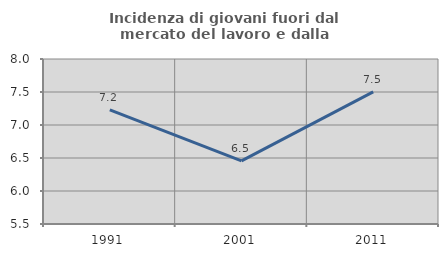
| Category | Incidenza di giovani fuori dal mercato del lavoro e dalla formazione  |
|---|---|
| 1991.0 | 7.229 |
| 2001.0 | 6.456 |
| 2011.0 | 7.501 |